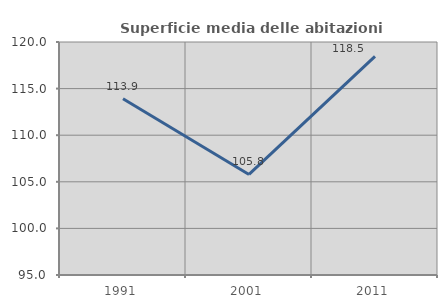
| Category | Superficie media delle abitazioni occupate |
|---|---|
| 1991.0 | 113.908 |
| 2001.0 | 105.79 |
| 2011.0 | 118.453 |